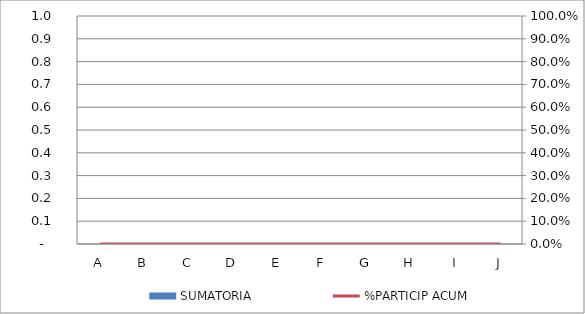
| Category | SUMATORIA |
|---|---|
| A | 0 |
| B | 0 |
| C | 0 |
| D | 0 |
| E | 0 |
| F | 0 |
| G | 0 |
| H | 0 |
| I | 0 |
| J | 0 |